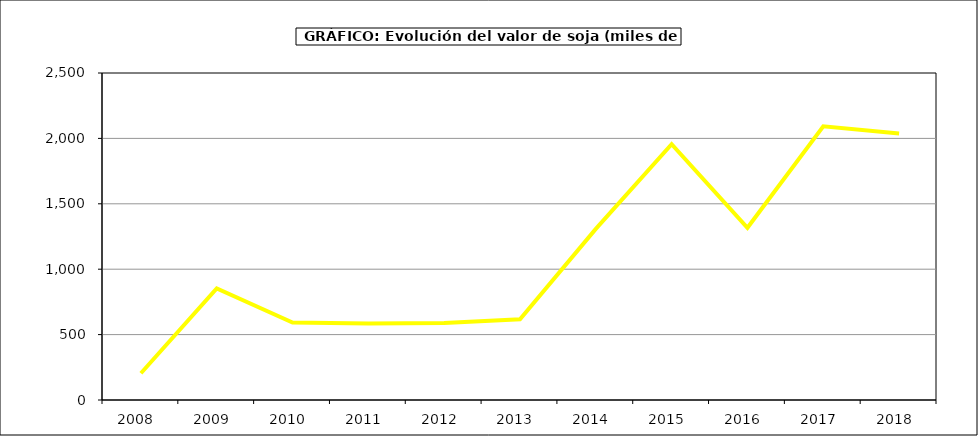
| Category | Valor |
|---|---|
| 2008.0 | 204.204 |
| 2009.0 | 853.62 |
| 2010.0 | 592.162 |
| 2011.0 | 584.814 |
| 2012.0 | 588.253 |
| 2013.0 | 616.743 |
| 2014.0 | 1308.04 |
| 2015.0 | 1956 |
| 2016.0 | 1317 |
| 2017.0 | 2092.786 |
| 2018.0 | 2037.396 |